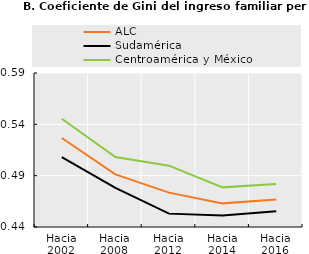
| Category | ALC | Sudamérica | Centroamérica y México |
|---|---|---|---|
| Hacia 2002 | 0.527 | 0.508 | 0.545 |
| Hacia 2008 | 0.491 | 0.478 | 0.508 |
| Hacia 2012 | 0.473 | 0.453 | 0.5 |
| Hacia 2014 | 0.463 | 0.451 | 0.479 |
| Hacia 2016 | 0.467 | 0.455 | 0.482 |